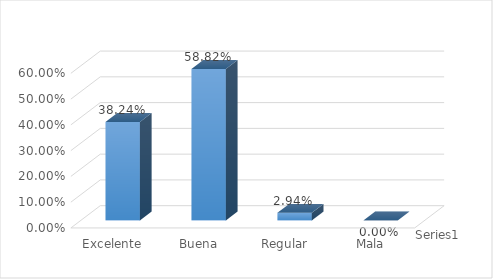
| Category | Series 0 |
|---|---|
| Excelente | 0.382 |
| Buena | 0.588 |
| Regular | 0.029 |
| Mala | 0 |